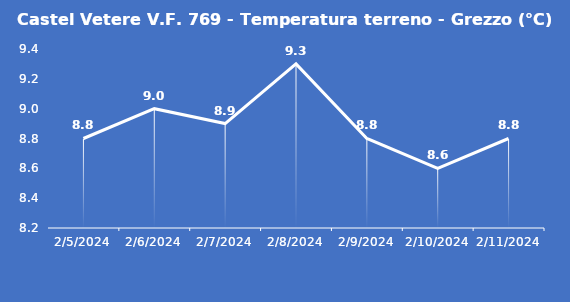
| Category | Castel Vetere V.F. 769 - Temperatura terreno - Grezzo (°C) |
|---|---|
| 2/5/24 | 8.8 |
| 2/6/24 | 9 |
| 2/7/24 | 8.9 |
| 2/8/24 | 9.3 |
| 2/9/24 | 8.8 |
| 2/10/24 | 8.6 |
| 2/11/24 | 8.8 |